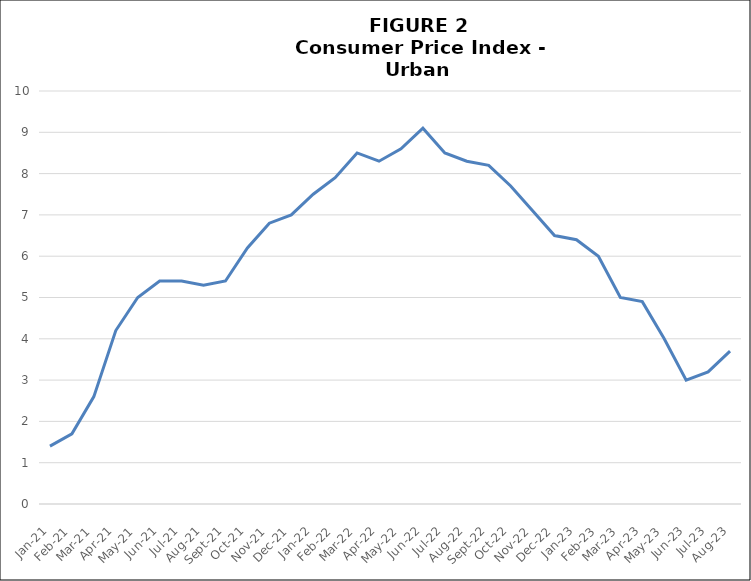
| Category | CPI-U |
|---|---|
| 2021-01-01 | 1.4 |
| 2021-02-01 | 1.7 |
| 2021-03-01 | 2.6 |
| 2021-04-01 | 4.2 |
| 2021-05-01 | 5 |
| 2021-06-01 | 5.4 |
| 2021-07-01 | 5.4 |
| 2021-08-01 | 5.3 |
| 2021-09-01 | 5.4 |
| 2021-10-01 | 6.2 |
| 2021-11-01 | 6.8 |
| 2021-12-01 | 7 |
| 2022-01-01 | 7.5 |
| 2022-02-01 | 7.9 |
| 2022-03-01 | 8.5 |
| 2022-04-01 | 8.3 |
| 2022-05-01 | 8.6 |
| 2022-06-01 | 9.1 |
| 2022-07-01 | 8.5 |
| 2022-08-01 | 8.3 |
| 2022-09-01 | 8.2 |
| 2022-10-01 | 7.7 |
| 2022-11-01 | 7.1 |
| 2022-12-01 | 6.5 |
| 2023-01-01 | 6.4 |
| 2023-02-01 | 6 |
| 2023-03-01 | 5 |
| 2023-04-01 | 4.9 |
| 2023-05-01 | 4 |
| 2023-06-01 | 3 |
| 2023-07-01 | 3.2 |
| 2023-08-01 | 3.7 |